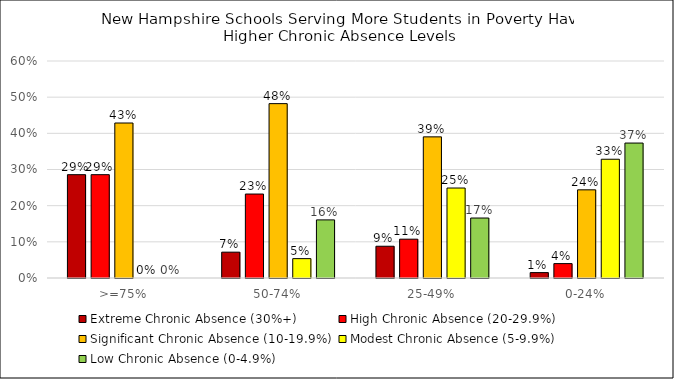
| Category | Extreme Chronic Absence (30%+) | High Chronic Absence (20-29.9%) | Significant Chronic Absence (10-19.9%) | Modest Chronic Absence (5-9.9%) | Low Chronic Absence (0-4.9%) |
|---|---|---|---|---|---|
| >=75% | 0.286 | 0.286 | 0.429 | 0 | 0 |
| 50-74% | 0.071 | 0.232 | 0.482 | 0.054 | 0.161 |
| 25-49% | 0.088 | 0.107 | 0.39 | 0.249 | 0.166 |
| 0-24% | 0.015 | 0.04 | 0.244 | 0.328 | 0.373 |